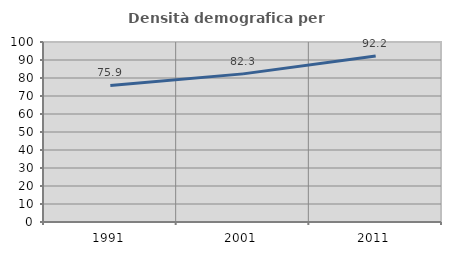
| Category | Densità demografica |
|---|---|
| 1991.0 | 75.873 |
| 2001.0 | 82.289 |
| 2011.0 | 92.174 |